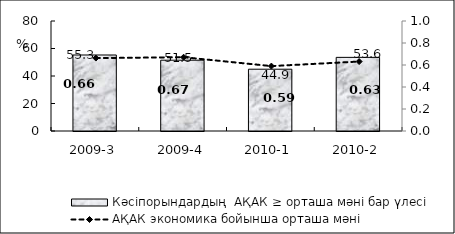
| Category | Кәсіпорындардың  АҚАК ≥ орташа мәні бар үлесі  |
|---|---|
| 2009-3 | 55.28 |
| 2009-4 | 51.5 |
| 2010-1 | 44.94 |
| 2010-2 | 53.55 |